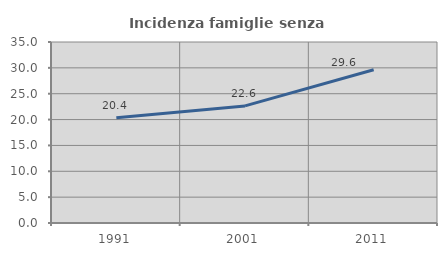
| Category | Incidenza famiglie senza nuclei |
|---|---|
| 1991.0 | 20.356 |
| 2001.0 | 22.638 |
| 2011.0 | 29.64 |